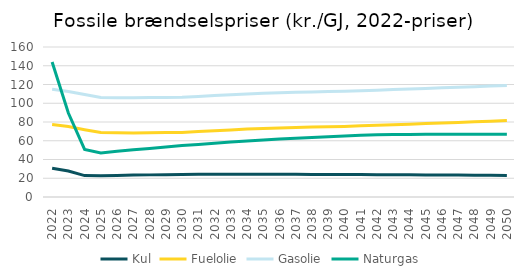
| Category | Kul | Fuelolie | Gasolie | Naturgas |
|---|---|---|---|---|
| 2022.0 | 30.77 | 77.45 | 114.92 | 144.02 |
| 2023.0 | 27.69 | 75.15 | 112.62 | 89.53 |
| 2024.0 | 22.82 | 71.82 | 109.29 | 50.83 |
| 2025.0 | 22.79 | 68.73 | 106.21 | 47.05 |
| 2026.0 | 23.06 | 68.41 | 105.88 | 48.69 |
| 2027.0 | 23.34 | 68.39 | 105.87 | 50.3 |
| 2028.0 | 23.6 | 68.53 | 106.01 | 51.86 |
| 2029.0 | 23.86 | 68.7 | 106.17 | 53.37 |
| 2030.0 | 24.1 | 68.8 | 106.27 | 54.83 |
| 2031.0 | 24.14 | 69.74 | 107.21 | 56.11 |
| 2032.0 | 24.18 | 70.7 | 108.17 | 57.36 |
| 2033.0 | 24.21 | 71.57 | 109.04 | 58.55 |
| 2034.0 | 24.23 | 72.41 | 109.88 | 59.71 |
| 2035.0 | 24.24 | 73.18 | 110.65 | 60.81 |
| 2036.0 | 24.2 | 73.71 | 111.18 | 61.74 |
| 2037.0 | 24.14 | 74.16 | 111.64 | 62.61 |
| 2038.0 | 24.09 | 74.59 | 112.07 | 63.45 |
| 2039.0 | 24.02 | 74.95 | 112.42 | 64.25 |
| 2040.0 | 23.95 | 75.29 | 112.76 | 65.03 |
| 2041.0 | 23.88 | 75.87 | 113.35 | 65.77 |
| 2042.0 | 23.8 | 76.48 | 113.96 | 66.49 |
| 2043.0 | 23.72 | 77.08 | 114.55 | 66.63 |
| 2044.0 | 23.64 | 77.7 | 115.18 | 66.76 |
| 2045.0 | 23.54 | 78.31 | 115.78 | 66.84 |
| 2046.0 | 23.45 | 78.95 | 116.42 | 66.92 |
| 2047.0 | 23.35 | 79.57 | 117.04 | 66.94 |
| 2048.0 | 23.24 | 80.21 | 117.68 | 66.96 |
| 2049.0 | 23.13 | 80.84 | 118.31 | 66.94 |
| 2050.0 | 23.02 | 81.49 | 118.97 | 66.9 |